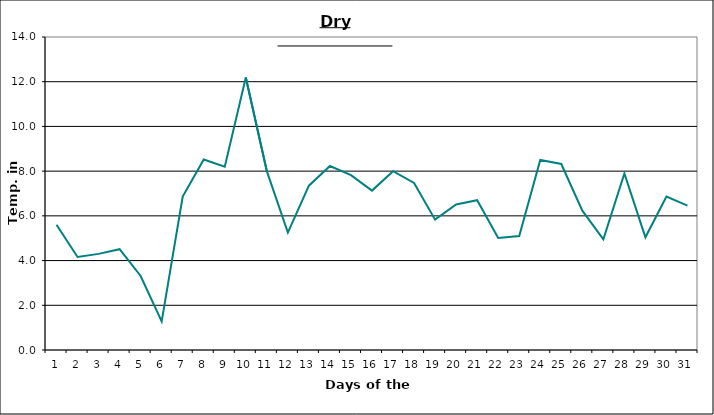
| Category | Series 0 |
|---|---|
| 0 | 5.6 |
| 1 | 4.16 |
| 2 | 4.3 |
| 3 | 4.51 |
| 4 | 3.31 |
| 5 | 1.28 |
| 6 | 6.86 |
| 7 | 8.52 |
| 8 | 8.2 |
| 9 | 12.19 |
| 10 | 8 |
| 11 | 5.25 |
| 12 | 7.35 |
| 13 | 8.23 |
| 14 | 7.82 |
| 15 | 7.13 |
| 16 | 8 |
| 17 | 7.47 |
| 18 | 5.83 |
| 19 | 6.51 |
| 20 | 6.7 |
| 21 | 5.01 |
| 22 | 5.1 |
| 23 | 8.5 |
| 24 | 8.32 |
| 25 | 6.23 |
| 26 | 4.95 |
| 27 | 7.9 |
| 28 | 5.04 |
| 29 | 6.86 |
| 30 | 6.46 |